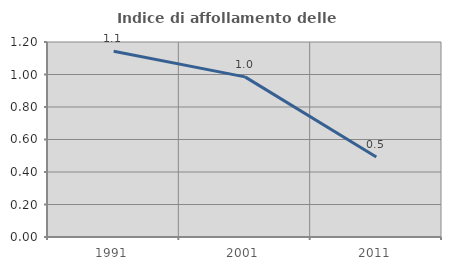
| Category | Indice di affollamento delle abitazioni  |
|---|---|
| 1991.0 | 1.143 |
| 2001.0 | 0.985 |
| 2011.0 | 0.493 |